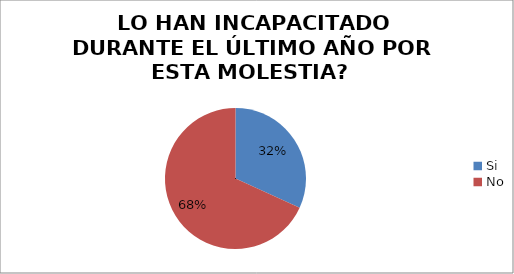
| Category | Series 0 |
|---|---|
| Si | 7 |
| No | 15 |